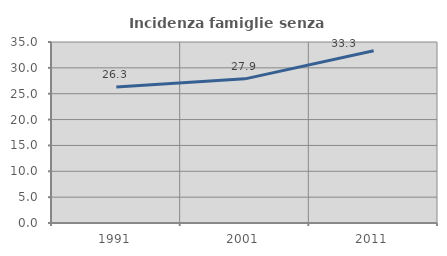
| Category | Incidenza famiglie senza nuclei |
|---|---|
| 1991.0 | 26.322 |
| 2001.0 | 27.876 |
| 2011.0 | 33.301 |